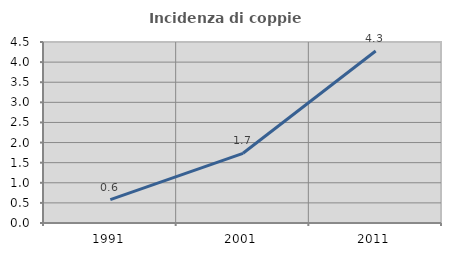
| Category | Incidenza di coppie miste |
|---|---|
| 1991.0 | 0.579 |
| 2001.0 | 1.733 |
| 2011.0 | 4.277 |